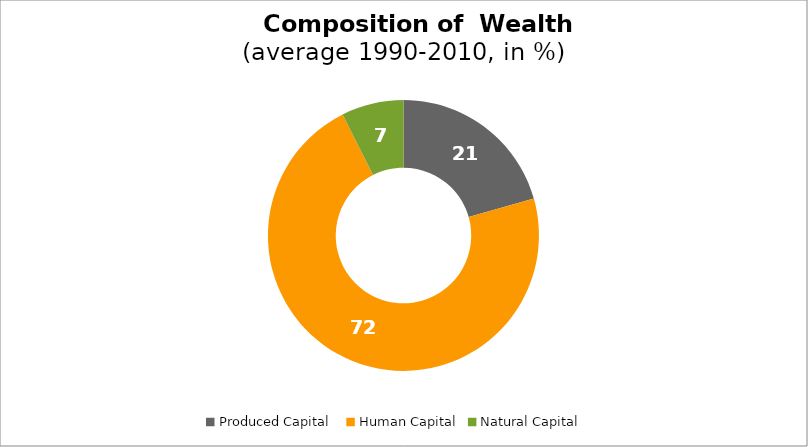
| Category | Series 0 |
|---|---|
| Produced Capital  | 20.606 |
| Human Capital | 71.971 |
| Natural Capital | 7.423 |